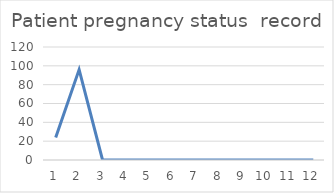
| Category | Patient pregnancy status  record |
|---|---|
| 0 | 24 |
| 1 | 96 |
| 2 | 0 |
| 3 | 0 |
| 4 | 0 |
| 5 | 0 |
| 6 | 0 |
| 7 | 0 |
| 8 | 0 |
| 9 | 0 |
| 10 | 0 |
| 11 | 0 |